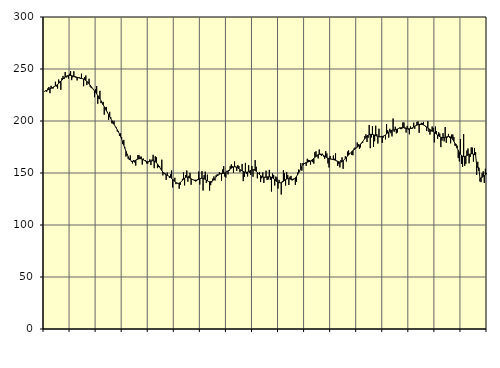
| Category | Piggar | Series 1 |
|---|---|---|
| nan | 228.1 | 228.41 |
| 87.0 | 229.5 | 229.07 |
| 87.0 | 228.1 | 229.38 |
| 87.0 | 231.3 | 229.88 |
| 87.0 | 232.7 | 230.41 |
| 87.0 | 226.7 | 230.97 |
| 87.0 | 233.8 | 231.55 |
| 87.0 | 231.2 | 232.08 |
| 87.0 | 231.3 | 232.6 |
| 87.0 | 233.3 | 233.1 |
| 87.0 | 237.8 | 233.68 |
| 87.0 | 233.2 | 234.37 |
| nan | 231.2 | 235.19 |
| 88.0 | 239.9 | 236.11 |
| 88.0 | 238.1 | 237.12 |
| 88.0 | 230 | 238.21 |
| 88.0 | 241.2 | 239.32 |
| 88.0 | 243.3 | 240.39 |
| 88.0 | 240.3 | 241.4 |
| 88.0 | 247.1 | 242.29 |
| 88.0 | 241.8 | 243.02 |
| 88.0 | 242.8 | 243.56 |
| 88.0 | 240.9 | 243.86 |
| 88.0 | 245.4 | 243.93 |
| nan | 247.9 | 243.81 |
| 89.0 | 239.3 | 243.58 |
| 89.0 | 242 | 243.28 |
| 89.0 | 247.8 | 242.95 |
| 89.0 | 242.1 | 242.64 |
| 89.0 | 241.6 | 242.33 |
| 89.0 | 239 | 242.02 |
| 89.0 | 241.3 | 241.71 |
| 89.0 | 242 | 241.44 |
| 89.0 | 240.4 | 241.2 |
| 89.0 | 245.5 | 240.96 |
| 89.0 | 241 | 240.7 |
| nan | 233.4 | 240.33 |
| 90.0 | 242.2 | 239.77 |
| 90.0 | 243.8 | 239.05 |
| 90.0 | 234.6 | 238.15 |
| 90.0 | 236.4 | 237.04 |
| 90.0 | 240.6 | 235.8 |
| 90.0 | 233 | 234.47 |
| 90.0 | 231.6 | 233.09 |
| 90.0 | 231.7 | 231.71 |
| 90.0 | 230.8 | 230.33 |
| 90.0 | 222.9 | 228.93 |
| 90.0 | 230.6 | 227.48 |
| nan | 233.6 | 226.04 |
| 91.0 | 216.6 | 224.54 |
| 91.0 | 221.2 | 222.92 |
| 91.0 | 229 | 221.2 |
| 91.0 | 217.2 | 219.42 |
| 91.0 | 217.1 | 217.55 |
| 91.0 | 218.4 | 215.63 |
| 91.0 | 206.1 | 213.69 |
| 91.0 | 213 | 211.76 |
| 91.0 | 213.5 | 209.84 |
| 91.0 | 208.7 | 207.96 |
| 91.0 | 201 | 206.09 |
| nan | 208.8 | 204.2 |
| 92.0 | 203.7 | 202.33 |
| 92.0 | 197.8 | 200.49 |
| 92.0 | 197.5 | 198.65 |
| 92.0 | 200.2 | 196.83 |
| 92.0 | 195.2 | 195.07 |
| 92.0 | 193.9 | 193.34 |
| 92.0 | 190 | 191.57 |
| 92.0 | 190.4 | 189.68 |
| 92.0 | 185.7 | 187.55 |
| 92.0 | 188.1 | 185.15 |
| 92.0 | 184.7 | 182.52 |
| nan | 177.8 | 179.68 |
| 93.0 | 181.8 | 176.72 |
| 93.0 | 174.6 | 173.75 |
| 93.0 | 165.8 | 170.88 |
| 93.0 | 167.1 | 168.19 |
| 93.0 | 163.7 | 165.8 |
| 93.0 | 162.7 | 163.83 |
| 93.0 | 167 | 162.41 |
| 93.0 | 160.9 | 161.55 |
| 93.0 | 159.2 | 161.23 |
| 93.0 | 162.4 | 161.34 |
| 93.0 | 160.1 | 161.74 |
| nan | 157.1 | 162.31 |
| 94.0 | 163.5 | 162.91 |
| 94.0 | 167.3 | 163.39 |
| 94.0 | 167.1 | 163.71 |
| 94.0 | 165.6 | 163.82 |
| 94.0 | 165.8 | 163.65 |
| 94.0 | 158.1 | 163.26 |
| 94.0 | 163.9 | 162.68 |
| 94.0 | 161.8 | 162.01 |
| 94.0 | 162.4 | 161.41 |
| 94.0 | 159.2 | 161.01 |
| 94.0 | 158.9 | 160.86 |
| nan | 160.5 | 160.97 |
| 95.0 | 163.1 | 161.24 |
| 95.0 | 157.6 | 161.55 |
| 95.0 | 162.9 | 161.76 |
| 95.0 | 167.5 | 161.76 |
| 95.0 | 154.6 | 161.49 |
| 95.0 | 166.1 | 160.9 |
| 95.0 | 165.1 | 159.98 |
| 95.0 | 154.7 | 158.73 |
| 95.0 | 155.7 | 157.21 |
| 95.0 | 156.7 | 155.53 |
| 95.0 | 153.8 | 153.84 |
| nan | 162.8 | 152.28 |
| 96.0 | 147.7 | 150.92 |
| 96.0 | 150.4 | 149.8 |
| 96.0 | 149.6 | 148.92 |
| 96.0 | 143.4 | 148.22 |
| 96.0 | 150.4 | 147.66 |
| 96.0 | 147.1 | 147.16 |
| 96.0 | 145.2 | 146.58 |
| 96.0 | 148.7 | 145.86 |
| 96.0 | 152.4 | 144.97 |
| 96.0 | 136.1 | 143.94 |
| 96.0 | 143.2 | 142.84 |
| nan | 145.4 | 141.74 |
| 97.0 | 139.3 | 140.83 |
| 97.0 | 140.6 | 140.22 |
| 97.0 | 139.9 | 139.98 |
| 97.0 | 134.9 | 140.19 |
| 97.0 | 138.7 | 140.83 |
| 97.0 | 141.6 | 141.77 |
| 97.0 | 144.4 | 142.9 |
| 97.0 | 150.6 | 144.03 |
| 97.0 | 138.1 | 145.02 |
| 97.0 | 148.1 | 145.74 |
| 97.0 | 152.4 | 146.11 |
| nan | 141.6 | 146.08 |
| 98.0 | 147.3 | 145.72 |
| 98.0 | 150.1 | 145.11 |
| 98.0 | 138.7 | 144.45 |
| 98.0 | 143.7 | 143.87 |
| 98.0 | 143.5 | 143.42 |
| 98.0 | 142.6 | 143.16 |
| 98.0 | 141.9 | 143.08 |
| 98.0 | 142.2 | 143.18 |
| 98.0 | 144.1 | 143.48 |
| 98.0 | 151.4 | 143.97 |
| 98.0 | 138.9 | 144.47 |
| nan | 145.1 | 144.85 |
| 99.0 | 151.8 | 145.01 |
| 99.0 | 133.1 | 144.89 |
| 99.0 | 148 | 144.48 |
| 99.0 | 151.3 | 143.88 |
| 99.0 | 140.5 | 143.17 |
| 99.0 | 148.4 | 142.46 |
| 99.0 | 142 | 141.89 |
| 99.0 | 133 | 141.62 |
| 99.0 | 138.3 | 141.69 |
| 99.0 | 140.9 | 142.05 |
| 99.0 | 144.6 | 142.71 |
| nan | 146.7 | 143.69 |
| 0.0 | 142.8 | 144.86 |
| 0.0 | 147.8 | 146.11 |
| 0.0 | 148.8 | 147.31 |
| 0.0 | 147.7 | 148.25 |
| 0.0 | 150.8 | 148.87 |
| 0.0 | 149.8 | 149.22 |
| 0.0 | 142.6 | 149.38 |
| 0.0 | 153.5 | 149.52 |
| 0.0 | 156.6 | 149.73 |
| 0.0 | 146.6 | 150.09 |
| 0.0 | 145.6 | 150.59 |
| nan | 152.2 | 151.23 |
| 1.0 | 148.7 | 152.01 |
| 1.0 | 151.9 | 152.9 |
| 1.0 | 156.5 | 153.77 |
| 1.0 | 158.3 | 154.6 |
| 1.0 | 156.6 | 155.33 |
| 1.0 | 150.3 | 155.83 |
| 1.0 | 161 | 156.05 |
| 1.0 | 155.5 | 155.98 |
| 1.0 | 152 | 155.56 |
| 1.0 | 157.6 | 154.89 |
| 1.0 | 156.7 | 154.13 |
| nan | 150.8 | 153.35 |
| 2.0 | 152.4 | 152.61 |
| 2.0 | 158.7 | 151.99 |
| 2.0 | 142.2 | 151.45 |
| 2.0 | 146.2 | 151 |
| 2.0 | 159.7 | 150.73 |
| 2.0 | 149.2 | 150.72 |
| 2.0 | 146.6 | 150.95 |
| 2.0 | 157.5 | 151.37 |
| 2.0 | 150 | 151.92 |
| 2.0 | 148.1 | 152.47 |
| 2.0 | 156.7 | 152.87 |
| nan | 146.4 | 153.04 |
| 3.0 | 153.7 | 152.9 |
| 3.0 | 162.4 | 152.42 |
| 3.0 | 156 | 151.67 |
| 3.0 | 144.9 | 150.72 |
| 3.0 | 149.2 | 149.62 |
| 3.0 | 151 | 148.5 |
| 3.0 | 141.3 | 147.49 |
| 3.0 | 144.9 | 146.67 |
| 3.0 | 150.6 | 146.11 |
| 3.0 | 140.4 | 145.85 |
| 3.0 | 146.3 | 145.83 |
| nan | 152.2 | 145.99 |
| 4.0 | 143.2 | 146.22 |
| 4.0 | 143.8 | 146.36 |
| 4.0 | 153 | 146.38 |
| 4.0 | 143.4 | 146.25 |
| 4.0 | 132.2 | 145.88 |
| 4.0 | 149.6 | 145.27 |
| 4.0 | 148.1 | 144.48 |
| 4.0 | 138 | 143.59 |
| 4.0 | 146.6 | 142.64 |
| 4.0 | 145.7 | 141.78 |
| 4.0 | 135 | 141.12 |
| nan | 143.4 | 140.7 |
| 5.0 | 140.6 | 140.58 |
| 5.0 | 129.3 | 140.79 |
| 5.0 | 142.2 | 141.27 |
| 5.0 | 152.6 | 141.97 |
| 5.0 | 149.8 | 142.81 |
| 5.0 | 137.9 | 143.62 |
| 5.0 | 151 | 144.21 |
| 5.0 | 148 | 144.51 |
| 5.0 | 138.5 | 144.51 |
| 5.0 | 146.4 | 144.28 |
| 5.0 | 147.2 | 143.97 |
| nan | 142.8 | 143.78 |
| 6.0 | 144.5 | 143.84 |
| 6.0 | 144.5 | 144.33 |
| 6.0 | 138.6 | 145.27 |
| 6.0 | 141.6 | 146.59 |
| 6.0 | 150.4 | 148.21 |
| 6.0 | 153.3 | 150.13 |
| 6.0 | 151.6 | 152.17 |
| 6.0 | 159.4 | 154.17 |
| 6.0 | 152.2 | 156.04 |
| 6.0 | 159.6 | 157.62 |
| 6.0 | 159.7 | 158.79 |
| nan | 159.2 | 159.56 |
| 7.0 | 156.9 | 160.05 |
| 7.0 | 163.7 | 160.37 |
| 7.0 | 162.6 | 160.67 |
| 7.0 | 162.3 | 161.07 |
| 7.0 | 158 | 161.62 |
| 7.0 | 161.3 | 162.3 |
| 7.0 | 160.4 | 163.14 |
| 7.0 | 159 | 164.07 |
| 7.0 | 170.1 | 165.02 |
| 7.0 | 170.9 | 165.96 |
| 7.0 | 166 | 166.85 |
| nan | 164 | 167.58 |
| 8.0 | 172.6 | 168.08 |
| 8.0 | 167.3 | 168.26 |
| 8.0 | 166.4 | 168.07 |
| 8.0 | 168.5 | 167.57 |
| 8.0 | 165.8 | 166.89 |
| 8.0 | 163.7 | 166.14 |
| 8.0 | 171 | 165.42 |
| 8.0 | 168.8 | 164.79 |
| 8.0 | 159.2 | 164.29 |
| 8.0 | 155.3 | 163.88 |
| 8.0 | 166.4 | 163.54 |
| nan | 163.6 | 163.29 |
| 9.0 | 163.4 | 163.09 |
| 9.0 | 166.8 | 162.86 |
| 9.0 | 163.7 | 162.58 |
| 9.0 | 168.9 | 162.21 |
| 9.0 | 161.4 | 161.74 |
| 9.0 | 156.8 | 161.23 |
| 9.0 | 158.8 | 160.76 |
| 9.0 | 155.4 | 160.48 |
| 9.0 | 162.5 | 160.52 |
| 9.0 | 165 | 160.97 |
| 9.0 | 154 | 161.76 |
| nan | 162.8 | 162.76 |
| 10.0 | 166.1 | 163.89 |
| 10.0 | 161.1 | 165.05 |
| 10.0 | 170.6 | 166.21 |
| 10.0 | 171.7 | 167.36 |
| 10.0 | 169 | 168.48 |
| 10.0 | 169.4 | 169.55 |
| 10.0 | 167.3 | 170.56 |
| 10.0 | 167.1 | 171.47 |
| 10.0 | 173.5 | 172.31 |
| 10.0 | 174.5 | 173.11 |
| 10.0 | 174.3 | 173.96 |
| nan | 179.4 | 174.86 |
| 11.0 | 177.7 | 175.78 |
| 11.0 | 173.3 | 176.77 |
| 11.0 | 174.6 | 177.81 |
| 11.0 | 178.4 | 178.95 |
| 11.0 | 179 | 180.24 |
| 11.0 | 181.6 | 181.62 |
| 11.0 | 185.5 | 183.01 |
| 11.0 | 187.2 | 184.36 |
| 11.0 | 179.8 | 185.52 |
| 11.0 | 183.8 | 186.39 |
| 11.0 | 196.2 | 186.94 |
| nan | 173.9 | 187.19 |
| 12.0 | 184.2 | 187.2 |
| 12.0 | 195 | 187.04 |
| 12.0 | 175 | 186.78 |
| 12.0 | 180.5 | 186.42 |
| 12.0 | 195.5 | 185.96 |
| 12.0 | 187.4 | 185.51 |
| 12.0 | 178.3 | 185.12 |
| 12.0 | 192.6 | 184.85 |
| 12.0 | 184.5 | 184.79 |
| 12.0 | 185.6 | 184.89 |
| 12.0 | 179 | 185.12 |
| nan | 184.1 | 185.45 |
| 13.0 | 185.7 | 185.95 |
| 13.0 | 182.3 | 186.65 |
| 13.0 | 197 | 187.51 |
| 13.0 | 191.1 | 188.48 |
| 13.0 | 184 | 189.4 |
| 13.0 | 192.5 | 190.17 |
| 13.0 | 188.2 | 190.76 |
| 13.0 | 185.2 | 191.13 |
| 13.0 | 202.4 | 191.32 |
| 13.0 | 189.6 | 191.46 |
| 13.0 | 194.5 | 191.64 |
| nan | 188.1 | 191.91 |
| 14.0 | 189 | 192.29 |
| 14.0 | 192.5 | 192.72 |
| 14.0 | 193.7 | 193.12 |
| 14.0 | 192.2 | 193.42 |
| 14.0 | 192.2 | 193.61 |
| 14.0 | 198.6 | 193.68 |
| 14.0 | 198.6 | 193.62 |
| 14.0 | 192.6 | 193.43 |
| 14.0 | 188.9 | 193.12 |
| 14.0 | 195.3 | 192.79 |
| 14.0 | 191.4 | 192.57 |
| nan | 187.2 | 192.53 |
| 15.0 | 194.8 | 192.72 |
| 15.0 | 192.4 | 193.09 |
| 15.0 | 192.7 | 193.61 |
| 15.0 | 198.4 | 194.24 |
| 15.0 | 192.5 | 194.92 |
| 15.0 | 195.8 | 195.54 |
| 15.0 | 199.1 | 196.04 |
| 15.0 | 199.6 | 196.44 |
| 15.0 | 188.6 | 196.73 |
| 15.0 | 196.2 | 196.86 |
| 15.0 | 198.3 | 196.78 |
| nan | 198.1 | 196.57 |
| 16.0 | 199.2 | 196.19 |
| 16.0 | 196 | 195.63 |
| 16.0 | 194.3 | 194.94 |
| 16.0 | 190.3 | 194.16 |
| 16.0 | 199.8 | 193.3 |
| 16.0 | 189.5 | 192.48 |
| 16.0 | 186.9 | 191.73 |
| 16.0 | 189.9 | 191.02 |
| 16.0 | 194.7 | 190.37 |
| 16.0 | 193.4 | 189.71 |
| 16.0 | 179.5 | 188.97 |
| nan | 194.7 | 188.17 |
| 17.0 | 190.2 | 187.29 |
| 17.0 | 182.7 | 186.41 |
| 17.0 | 189.1 | 185.61 |
| 17.0 | 187.8 | 184.95 |
| 17.0 | 174.9 | 184.44 |
| 17.0 | 181.1 | 184.08 |
| 17.0 | 188.3 | 183.96 |
| 17.0 | 180.4 | 184.05 |
| 17.0 | 194.2 | 184.27 |
| 17.0 | 179.1 | 184.59 |
| 17.0 | 184.1 | 184.95 |
| nan | 187.6 | 185.16 |
| 18.0 | 183.9 | 185.04 |
| 18.0 | 178.5 | 184.59 |
| 18.0 | 187 | 183.64 |
| 18.0 | 187 | 182.22 |
| 18.0 | 184.5 | 180.46 |
| 18.0 | 176.3 | 178.45 |
| 18.0 | 177.9 | 176.21 |
| 18.0 | 176.3 | 173.9 |
| 18.0 | 164.5 | 171.71 |
| 18.0 | 161.2 | 169.72 |
| 18.0 | 182.7 | 168.08 |
| nan | 158.7 | 166.87 |
| 19.0 | 155.8 | 166.12 |
| 19.0 | 187.3 | 165.81 |
| 19.0 | 156.9 | 165.91 |
| 19.0 | 158.8 | 166.26 |
| 19.0 | 171.6 | 166.76 |
| 19.0 | 173.6 | 167.32 |
| 19.0 | 159.3 | 167.87 |
| 19.0 | 165.4 | 168.27 |
| 19.0 | 174.6 | 168.45 |
| 19.0 | 174.4 | 168.42 |
| 19.0 | 160.9 | 168.14 |
| nan | 174.1 | 167.63 |
| 20.0 | 170.2 | 167.07 |
| 20.0 | 148.1 | 157.72 |
| 20.0 | 160.8 | 155.2 |
| 20.0 | 152 | 155.02 |
| 20.0 | 141.9 | 144.86 |
| 20.0 | 141.2 | 145.24 |
| 20.0 | 149.7 | 145.87 |
| 20.0 | 151.6 | 146.69 |
| 20.0 | 140.4 | 147.56 |
| 20.0 | 154.1 | 148.33 |
| 20.0 | 150.1 | 148.95 |